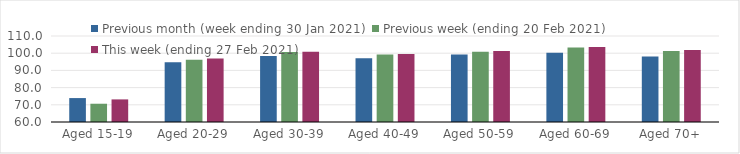
| Category | Previous month (week ending 30 Jan 2021) | Previous week (ending 20 Feb 2021) | This week (ending 27 Feb 2021) |
|---|---|---|---|
| Aged 15-19 | 73.91 | 70.62 | 73.14 |
| Aged 20-29 | 94.67 | 96.21 | 96.86 |
| Aged 30-39 | 98.42 | 100.63 | 100.91 |
| Aged 40-49 | 97.13 | 99.23 | 99.58 |
| Aged 50-59 | 99.25 | 100.9 | 101.33 |
| Aged 60-69 | 100.32 | 103.25 | 103.62 |
| Aged 70+ | 98.15 | 101.35 | 101.92 |